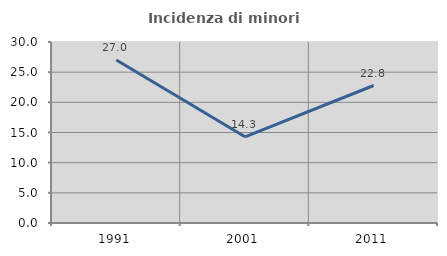
| Category | Incidenza di minori stranieri |
|---|---|
| 1991.0 | 27.027 |
| 2001.0 | 14.286 |
| 2011.0 | 22.79 |